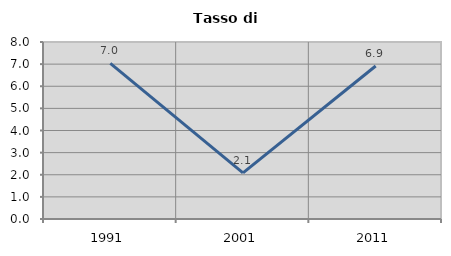
| Category | Tasso di disoccupazione   |
|---|---|
| 1991.0 | 7.037 |
| 2001.0 | 2.087 |
| 2011.0 | 6.915 |